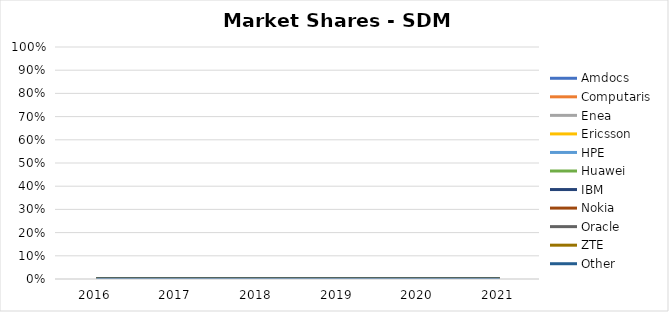
| Category | Amdocs | Computaris | Enea | Ericsson | HPE | Huawei | IBM | Nokia | Oracle | ZTE | Other |
|---|---|---|---|---|---|---|---|---|---|---|---|
| 2016.0 | 0 | 0 | 0 | 0 | 0 | 0 | 0 | 0 | 0 | 0 | 0 |
| 2017.0 | 0 | 0 | 0 | 0 | 0 | 0 | 0 | 0 | 0 | 0 | 0 |
| 2018.0 | 0 | 0 | 0 | 0 | 0 | 0 | 0 | 0 | 0 | 0 | 0 |
| 2019.0 | 0 | 0 | 0 | 0 | 0 | 0 | 0 | 0 | 0 | 0 | 0 |
| 2020.0 | 0 | 0 | 0 | 0 | 0 | 0 | 0 | 0 | 0 | 0 | 0 |
| 2021.0 | 0 | 0 | 0 | 0 | 0 | 0 | 0 | 0 | 0 | 0 | 0 |